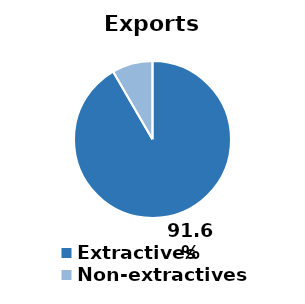
| Category | Exports (%) |
|---|---|
| Extractives | 0.916 |
| Non-extractives | 0.084 |